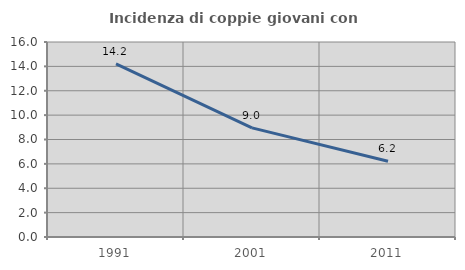
| Category | Incidenza di coppie giovani con figli |
|---|---|
| 1991.0 | 14.211 |
| 2001.0 | 8.955 |
| 2011.0 | 6.218 |